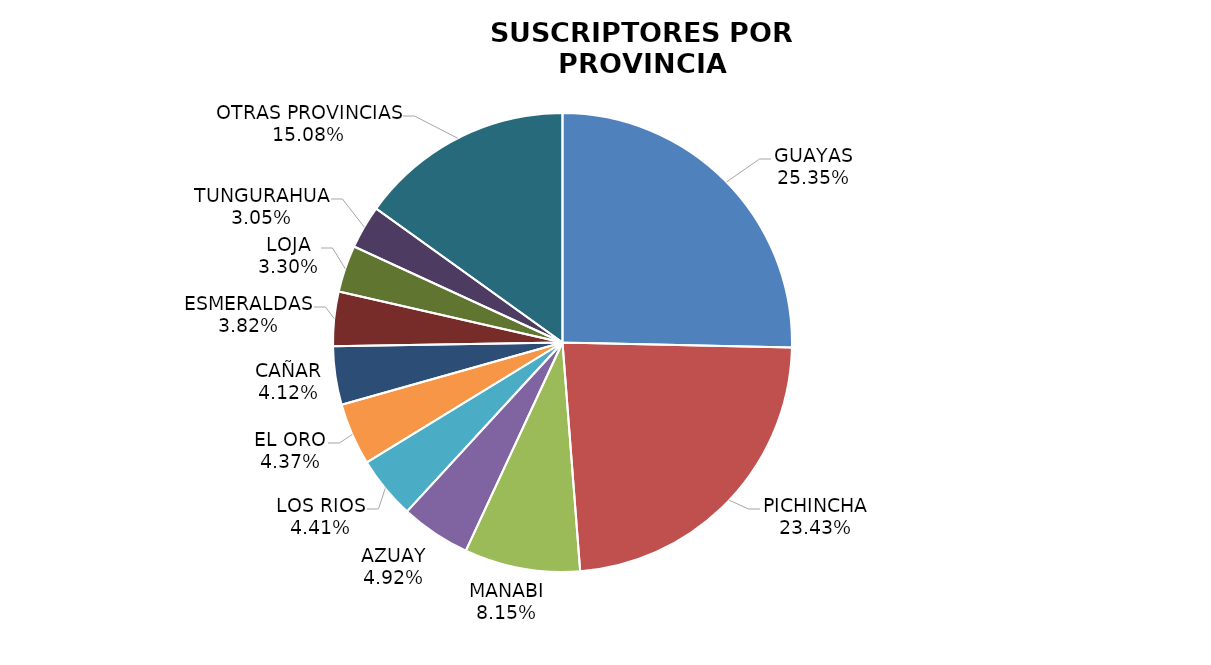
| Category | Series 0 |
|---|---|
| GUAYAS | 138006.199 |
| PICHINCHA | 127560.402 |
| MANABI | 44349.575 |
| AZUAY | 26796.183 |
| LOS RIOS | 24020.184 |
| EL ORO | 23816.497 |
| CAÑAR | 22429.653 |
| ESMERALDAS | 20800.694 |
| LOJA | 17985.972 |
| TUNGURAHUA | 16614.639 |
| OTRAS PROVINCIAS | 82125.002 |